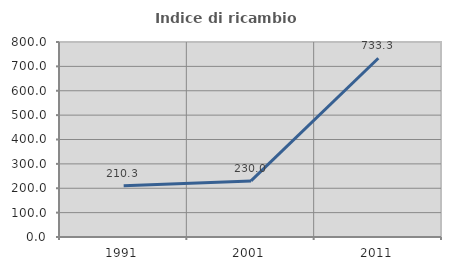
| Category | Indice di ricambio occupazionale  |
|---|---|
| 1991.0 | 210.345 |
| 2001.0 | 230 |
| 2011.0 | 733.333 |